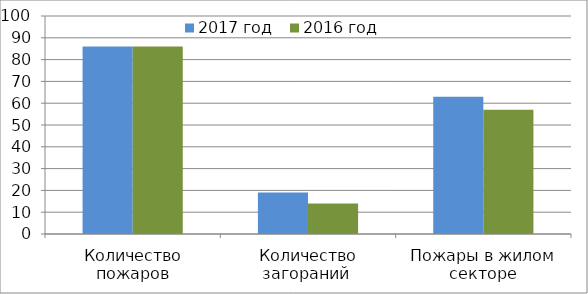
| Category | 2017 год | 2016 год |
|---|---|---|
| Количество пожаров | 86 | 86 |
| Количество загораний  | 19 | 14 |
| Пожары в жилом секторе | 63 | 57 |